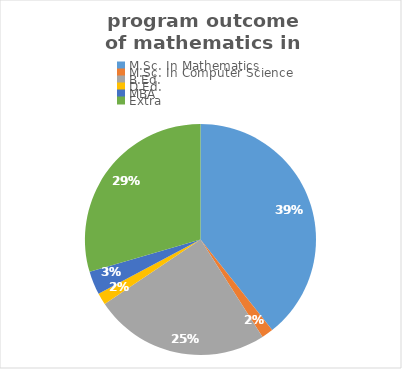
| Category | Series 0 |
|---|---|
| M.Sc. In Mathematics | 24 |
| M.Sc. In Computer Science | 1 |
| B.Ed. | 15 |
| D.Ed. | 1 |
| MBA | 2 |
| Extra | 18 |